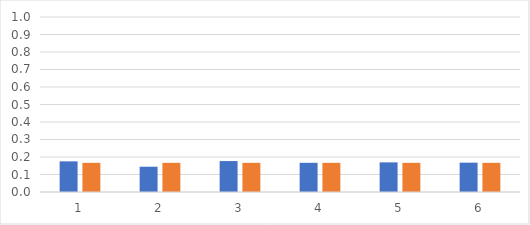
| Category | rel freq | prob |
|---|---|---|
| 0 | 0.175 | 0.167 |
| 1 | 0.144 | 0.167 |
| 2 | 0.177 | 0.167 |
| 3 | 0.167 | 0.167 |
| 4 | 0.169 | 0.167 |
| 5 | 0.168 | 0.167 |